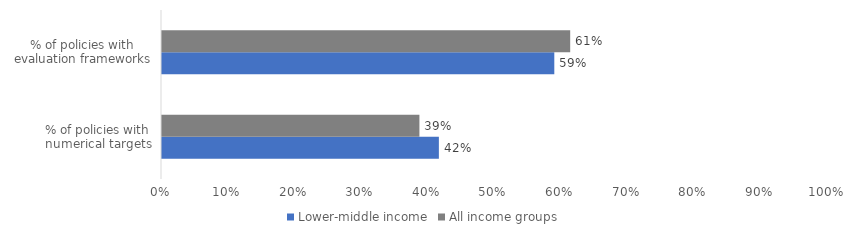
| Category | Lower-middle income | All income groups |
|---|---|---|
| % of policies with numerical targets | 0.416 | 0.387 |
| % of policies with evaluation frameworks | 0.589 | 0.613 |